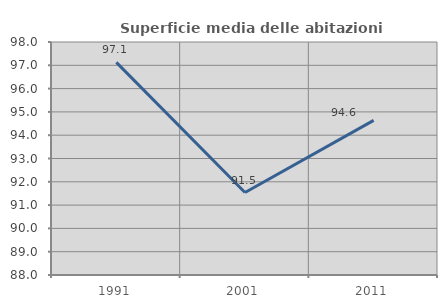
| Category | Superficie media delle abitazioni occupate |
|---|---|
| 1991.0 | 97.124 |
| 2001.0 | 91.539 |
| 2011.0 | 94.638 |